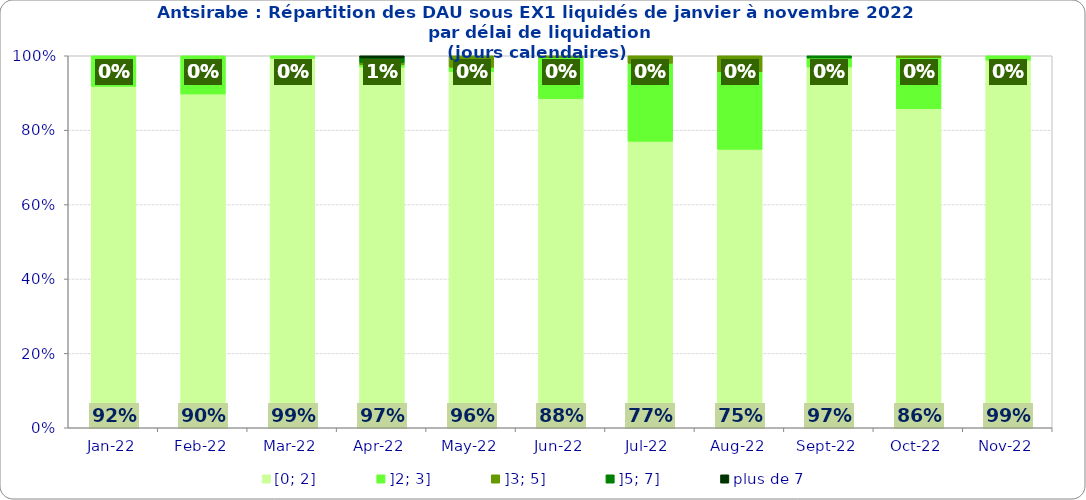
| Category | [0; 2] | ]2; 3] | ]3; 5] | ]5; 7] | plus de 7 |
|---|---|---|---|---|---|
| 2022-01-01 | 0.918 | 0.082 | 0 | 0 | 0 |
| 2022-02-01 | 0.897 | 0.103 | 0 | 0 | 0 |
| 2022-03-01 | 0.993 | 0.007 | 0 | 0 | 0 |
| 2022-04-01 | 0.97 | 0.006 | 0.006 | 0.012 | 0.006 |
| 2022-05-01 | 0.957 | 0.012 | 0.031 | 0 | 0 |
| 2022-06-01 | 0.885 | 0.11 | 0.005 | 0 | 0 |
| 2022-07-01 | 0.77 | 0.209 | 0.02 | 0 | 0 |
| 2022-08-01 | 0.748 | 0.209 | 0.043 | 0 | 0 |
| 2022-09-01 | 0.97 | 0.024 | 0 | 0.006 | 0 |
| 2022-10-01 | 0.858 | 0.137 | 0.005 | 0 | 0 |
| 2022-11-01 | 0.988 | 0.012 | 0 | 0 | 0 |